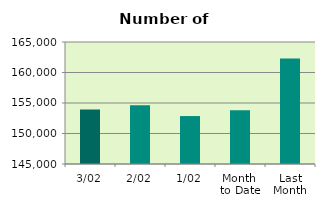
| Category | Series 0 |
|---|---|
| 3/02 | 153942 |
| 2/02 | 154632 |
| 1/02 | 152858 |
| Month 
to Date | 153810.667 |
| Last
Month | 162275.9 |